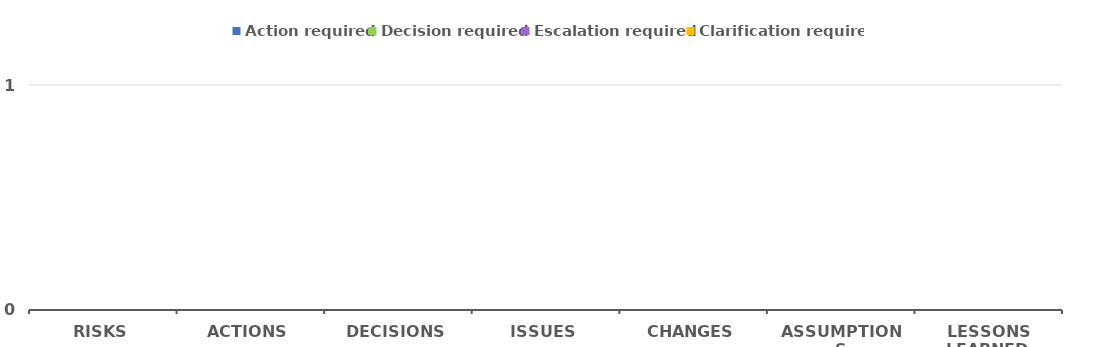
| Category | Action required | Decision required | Escalation required | Clarification required |
|---|---|---|---|---|
| RISKS | 0 | 0 | 0 | 0 |
| ACTIONS | 0 | 0 | 0 | 0 |
| DECISIONS | 0 | 0 | 0 | 0 |
| ISSUES | 0 | 0 | 0 | 0 |
| CHANGES | 0 | 0 | 0 | 0 |
| ASSUMPTIONS | 0 | 0 | 0 | 0 |
| LESSONS LEARNED | 0 | 0 | 0 | 0 |